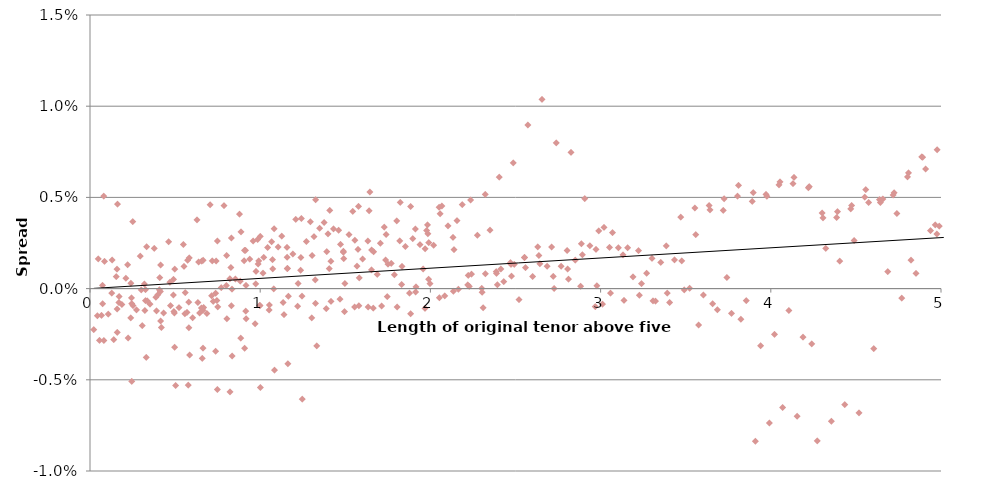
| Category | Series 0 |
|---|---|
| 0.02226133437632427 | -0.002 |
| 0.04349449318648535 | -0.001 |
| 0.048596851471595315 | 0.002 |
| 0.05544147843942504 | -0.003 |
| 0.06791390980302747 | -0.001 |
| 0.07311306079273194 | 0 |
| 0.07388937779081495 | -0.001 |
| 0.08145106091717924 | 0.005 |
| 0.08172484599589236 | -0.003 |
| 0.08514120763027044 | 0.001 |
| 0.10674358723639976 | -0.001 |
| 0.12811897206147727 | 0 |
| 0.13030008285601102 | 0.002 |
| 0.1393192707361086 | -0.003 |
| 0.15465254512050297 | 0.001 |
| 0.15889312603891614 | -0.001 |
| 0.15906317888283894 | 0.001 |
| 0.16019686450897908 | -0.002 |
| 0.1618917245200615 | 0.005 |
| 0.1697141553404382 | -0.001 |
| 0.17079145502359605 | 0 |
| 0.18750675456608512 | -0.001 |
| 0.210781917147421 | 0.001 |
| 0.22108145106091737 | 0.001 |
| 0.22394374961110142 | -0.003 |
| 0.23887748117727448 | -0.002 |
| 0.24037085433389294 | 0 |
| 0.24363612659300493 | -0.001 |
| 0.24476981221914684 | -0.005 |
| 0.2450016210958612 | -0.001 |
| 0.2511978097193701 | 0.004 |
| 0.25206894406073044 | -0.001 |
| 0.27322506377947864 | -0.001 |
| 0.2950034223134832 | 0.002 |
| 0.30113099312277924 | 0 |
| 0.30660669469704427 | -0.002 |
| 0.31978817680752236 | 0 |
| 0.32275527347395894 | -0.001 |
| 0.32588029507947525 | -0.001 |
| 0.32599091531329716 | 0 |
| 0.33071993030925206 | -0.004 |
| 0.3324621989919736 | 0.002 |
| 0.3361956318835171 | -0.001 |
| 0.3526423862531063 | -0.001 |
| 0.37741273100615924 | 0.002 |
| 0.3868458714454617 | 0 |
| 0.39082819986310824 | -0.001 |
| 0.39919385504601124 | 0 |
| 0.40737975234895174 | 0 |
| 0.4101176031360847 | 0.001 |
| 0.4133828753951967 | 0 |
| 0.41481698771226583 | 0.001 |
| 0.41546885694729596 | -0.002 |
| 0.4188585769694608 | -0.002 |
| 0.43204806449159694 | -0.001 |
| 0.4618878725654918 | 0.003 |
| 0.4695740034549072 | 0 |
| 0.4732375085557834 | -0.001 |
| 0.4900426974348946 | 0.001 |
| 0.4901730712818999 | 0 |
| 0.49278054822202755 | -0.001 |
| 0.49573766411548803 | -0.001 |
| 0.49695251132622786 | -0.003 |
| 0.4974799327982078 | 0.001 |
| 0.503080082135523 | -0.005 |
| 0.5230272807274856 | -0.001 |
| 0.5486148636478259 | 0.002 |
| 0.5522369485408491 | 0.001 |
| 0.5577126501151142 | -0.001 |
| 0.559566266796355 | 0 |
| 0.5701574264202609 | -0.001 |
| 0.5742642026009586 | 0.002 |
| 0.5770020533880906 | -0.005 |
| 0.5798643519382738 | -0.001 |
| 0.5809132687982785 | -0.002 |
| 0.583430050888313 | 0.002 |
| 0.5854893908281991 | -0.004 |
| 0.6030116358658457 | -0.002 |
| 0.6283693491085689 | 0.004 |
| 0.6337764328686211 | -0.001 |
| 0.6381870666309561 | 0.001 |
| 0.64443964119745 | -0.001 |
| 0.6540352187169445 | -0.001 |
| 0.6566735112936346 | 0.002 |
| 0.6594113620807667 | -0.004 |
| 0.6637421442349574 | -0.001 |
| 0.6639614093412867 | -0.003 |
| 0.6644888308132666 | 0.002 |
| 0.6680029985984826 | -0.001 |
| 0.6868894281625293 | -0.001 |
| 0.7056810403832996 | 0.005 |
| 0.7146551068522315 | 0 |
| 0.7189380020894127 | 0.002 |
| 0.7241941266581922 | -0.001 |
| 0.7378833805938525 | -0.003 |
| 0.7386596975919355 | 0 |
| 0.7411486528529645 | 0.002 |
| 0.7460969329552487 | -0.001 |
| 0.7485343570514535 | -0.006 |
| 0.7486155186360532 | 0.003 |
| 0.750357787318773 | -0.001 |
| 0.7715139070375212 | 0 |
| 0.7873842717677144 | 0.005 |
| 0.8015058179329237 | 0 |
| 0.8032913727940949 | 0.002 |
| 0.8042436687200549 | -0.002 |
| 0.8213226426778775 | 0.001 |
| 0.8224563283040203 | -0.006 |
| 0.8278756439353003 | 0.001 |
| 0.8306698806654182 | -0.001 |
| 0.8309703073563446 | 0.003 |
| 0.8344844751415597 | -0.004 |
| 0.8344844751415597 | 0 |
| 0.854176852123465 | 0.001 |
| 0.8781656399726234 | 0.004 |
| 0.8832090493173395 | 0 |
| 0.8857273230989859 | -0.003 |
| 0.8868114845635642 | 0.003 |
| 0.9055441478439414 | 0.002 |
| 0.9076301293960443 | 0.002 |
| 0.9084064463941255 | -0.003 |
| 0.9136332524422874 | 0.002 |
| 0.914800690981389 | -0.001 |
| 0.9171474202275016 | 0 |
| 0.9171474202275016 | -0.002 |
| 0.9383983572895271 | 0.002 |
| 0.9582151820344835 | 0.003 |
| 0.9696880805710366 | -0.002 |
| 0.973990417522244 | 0 |
| 0.9755754890305832 | 0.001 |
| 0.9849418206707741 | 0.003 |
| 0.9879534565366184 | 0.001 |
| 0.9910693914800692 | 0.002 |
| 0.9975880838303839 | -0.001 |
| 0.9992829438414654 | -0.001 |
| 0.9995833705323935 | 0.003 |
| 1.0013689253935674 | -0.005 |
| 1.016427104722795 | 0.001 |
| 1.020807665982204 | 0.002 |
| 1.043930060357166 | 0.002 |
| 1.0525169560077154 | -0.001 |
| 1.0540399595841068 | -0.001 |
| 1.0666450520551907 | 0.003 |
| 1.07242859809595 | 0.002 |
| 1.0734241802003615 | 0.001 |
| 1.0800461111711517 | 0 |
| 1.082135523613963 | 0.003 |
| 1.0837782340862416 | -0.004 |
| 1.105282807541534 | 0.002 |
| 1.1266581923666097 | 0.003 |
| 1.1348717447280077 | -0.001 |
| 1.13975483790679 | -0.001 |
| 1.1574264202600943 | 0.002 |
| 1.1575508680231472 | 0.002 |
| 1.159155589178284 | 0.001 |
| 1.160555392588246 | 0.001 |
| 1.1622502525993301 | -0.004 |
| 1.1657644203845443 | 0 |
| 1.1920097986238698 | 0.002 |
| 1.2093211374525543 | 0.004 |
| 1.2194446924381737 | -0.001 |
| 1.2224829699162356 | 0 |
| 1.2374759623219589 | 0.001 |
| 1.238910074639028 | 0.002 |
| 1.24217534689814 | 0.004 |
| 1.245181742858172 | 0 |
| 1.2468232003094952 | -0.006 |
| 1.2717642840846137 | 0.003 |
| 1.2952712555426604 | 0.004 |
| 1.303575502754148 | -0.002 |
| 1.3051459150021776 | 0.002 |
| 1.3162217659137578 | 0.003 |
| 1.3231908406446395 | 0 |
| 1.3245874210966617 | -0.001 |
| 1.3263020347209258 | 0.005 |
| 1.3327733183996004 | -0.003 |
| 1.3490759753593435 | 0.003 |
| 1.376022191001118 | 0.004 |
| 1.3880577556142244 | -0.001 |
| 1.3910960330922828 | 0.002 |
| 1.3979249972981735 | 0.003 |
| 1.405918972654085 | 0.001 |
| 1.4086568234412171 | 0.004 |
| 1.415436263485545 | 0.002 |
| 1.4155666373325504 | -0.001 |
| 1.4307792067437584 | 0.003 |
| 1.4603755617057992 | 0.003 |
| 1.4688209229439106 | -0.001 |
| 1.4718469685507403 | 0.002 |
| 1.4885819177400288 | 0.002 |
| 1.4887063655030817 | 0.002 |
| 1.49131976852716 | 0.002 |
| 1.4955509924709105 | -0.001 |
| 1.4977910522058382 | 0 |
| 1.5215605749486638 | 0.003 |
| 1.5438956734752685 | 0.004 |
| 1.5545392321573042 | -0.001 |
| 1.5562003392554242 | 0.003 |
| 1.5687559075649427 | 0.001 |
| 1.5745320358301331 | 0.002 |
| 1.577269886617266 | 0.005 |
| 1.579428784767594 | -0.001 |
| 1.581917740028623 | 0.001 |
| 1.6016101170105284 | 0.002 |
| 1.6326596779422884 | 0.003 |
| 1.63395655463093 | -0.001 |
| 1.6397204510248926 | 0.004 |
| 1.6447638603696104 | 0.005 |
| 1.6544707858876242 | 0.001 |
| 1.6552829712885906 | 0.002 |
| 1.664053263642586 | -0.001 |
| 1.6665422189036159 | 0.002 |
| 1.6873249953332081 | 0.001 |
| 1.706149356965308 | 0.002 |
| 1.713362232869419 | -0.001 |
| 1.7284844554919125 | 0.003 |
| 1.7371989178970697 | 0.002 |
| 1.7396363419932745 | 0.003 |
| 1.7467162087285297 | 0 |
| 1.7506689067264007 | 0.001 |
| 1.7700531273426554 | 0.001 |
| 1.788140783169422 | 0.001 |
| 1.801974134514933 | 0.004 |
| 1.8043414491053094 | -0.001 |
| 1.8198618629830117 | 0.003 |
| 1.823156453762743 | 0.005 |
| 1.830937713894592 | 0 |
| 1.833023695446692 | 0.001 |
| 1.8527160724285983 | 0.002 |
| 1.8767606902265932 | 0 |
| 1.8839655607190462 | 0.004 |
| 1.8843258042436686 | -0.001 |
| 1.896189824321242 | 0.003 |
| 1.9119204582297629 | 0.003 |
| 1.9133470225872689 | 0 |
| 1.9156866405326385 | 0 |
| 1.9386661905187035 | 0.002 |
| 1.9567544023396186 | 0.001 |
| 1.968203596540354 | -0.001 |
| 1.9687965535290086 | 0.002 |
| 1.9777729745307822 | 0.003 |
| 1.9832486761050463 | 0.003 |
| 1.9854101372527833 | 0.003 |
| 1.9899286203187643 | 0.001 |
| 1.9902162096871594 | 0.003 |
| 1.9978221641466005 | 0 |
| 2.019417125977161 | 0.002 |
| 2.051983140603049 | 0.004 |
| 2.052828075415345 | 0 |
| 2.0574588421773132 | 0.004 |
| 2.0674015634568965 | 0.005 |
| 2.0845491552289346 | 0 |
| 2.103770496681846 | 0.003 |
| 2.1328618145866614 | 0.003 |
| 2.135491020501286 | 0 |
| 2.1383375161609264 | 0.002 |
| 2.156021470514066 | 0.004 |
| 2.1643036406896767 | 0 |
| 2.1872906084513133 | 0.005 |
| 2.2197125256673527 | 0 |
| 2.2224503764544847 | 0.001 |
| 2.227926078028746 | 0 |
| 2.2360151826270904 | 0.005 |
| 2.2416153319644083 | 0.001 |
| 2.2760546129183314 | 0.003 |
| 2.302121834360028 | 0 |
| 2.3039340308334157 | 0 |
| 2.30940973240768 | -0.001 |
| 2.3219653007171983 | 0.005 |
| 2.323318563348824 | 0.001 |
| 2.3495442919413536 | 0.003 |
| 2.3865969759193595 | 0.001 |
| 2.3878947883054673 | 0.001 |
| 2.393370489879728 | 0 |
| 2.4045174537987677 | 0.006 |
| 2.4140999315537304 | 0.001 |
| 2.431535718145466 | 0 |
| 2.4707236637421435 | 0.001 |
| 2.4733239670016935 | 0.001 |
| 2.4761993653164094 | 0.001 |
| 2.487069606880339 | 0.007 |
| 2.4921286789869956 | 0.001 |
| 2.520155625202637 | -0.001 |
| 2.553078452462434 | 0.002 |
| 2.553078452462434 | 0.002 |
| 2.5585541540367007 | 0.001 |
| 2.573019724970444 | 0.009 |
| 2.60014933731566 | 0.001 |
| 2.6303901437371673 | 0.002 |
| 2.6376514001726026 | 0.002 |
| 2.6431271017468676 | 0.001 |
| 2.6556826700563834 | 0.01 |
| 2.6860994554057687 | 0.001 |
| 2.7120933751215803 | 0.002 |
| 2.721782210488577 | 0.001 |
| 2.727257912062841 | 0 |
| 2.7399041752224518 | 0.008 |
| 2.768651608487339 | 0.001 |
| 2.8028747433264884 | 0.002 |
| 2.8062644633486507 | 0.001 |
| 2.811740164922914 | 0.001 |
| 2.8261464750171097 | 0.007 |
| 2.8512037615689074 | 0.002 |
| 2.882924285388353 | 0 |
| 2.8870276306783396 | 0.002 |
| 2.8925033322526037 | 0.002 |
| 2.9067886254744586 | 0.005 |
| 2.9371538796590135 | 0.002 |
| 2.9686391637110345 | -0.001 |
| 2.9727459398917313 | 0.002 |
| 2.9782216414659937 | 0 |
| 2.9890485968514735 | 0.003 |
| 3.01095140314853 | -0.001 |
| 3.0198168247449537 | 0.003 |
| 3.052163262365358 | 0.002 |
| 3.057638963939624 | 0 |
| 3.069489260454352 | 0.003 |
| 3.104038329911022 | 0.002 |
| 3.131568940603847 | 0.002 |
| 3.137044642178113 | -0.001 |
| 3.1587953456536617 | 0.002 |
| 3.190280629705681 | 0.001 |
| 3.222548156839734 | 0.002 |
| 3.2280238584140033 | 0 |
| 3.2400597349262643 | 0 |
| 3.2709227801630263 | 0.001 |
| 3.3025325119780984 | 0.002 |
| 3.308008213552359 | -0.001 |
| 3.3224145236465574 | -0.001 |
| 3.353182751540041 | 0.001 |
| 3.386410304274781 | 0.002 |
| 3.391886005849045 | 0 |
| 3.4050774687325003 | -0.001 |
| 3.4336234151429217 | 0.002 |
| 3.471034783149774 | 0.004 |
| 3.476510484724038 | 0.002 |
| 3.4910275868226055 | 0 |
| 3.522929500342233 | 0 |
| 3.5536977282357185 | 0.004 |
| 3.559173429809981 | 0.003 |
| 3.5756005345327733 | -0.002 |
| 3.604193889614834 | 0 |
| 3.637919233401778 | 0.005 |
| 3.6433949349760457 | 0.004 |
| 3.6579553232530664 | -0.001 |
| 3.686548678335125 | -0.001 |
| 3.7203285420944567 | 0.004 |
| 3.725804243668721 | 0.005 |
| 3.7420820110758495 | 0.001 |
| 3.769211623421068 | -0.001 |
| 3.8048036836537857 | 0.005 |
| 3.81027938522805 | 0.006 |
| 3.824744956161794 | -0.002 |
| 3.8551617415111767 | -0.001 |
| 3.8915306747361225 | 0.005 |
| 3.897006376310385 | 0.005 |
| 3.908966461327857 | -0.008 |
| 3.939734689221341 | -0.003 |
| 3.9712851601968637 | 0.005 |
| 3.9767608617711296 | 0.005 |
| 3.9913757700205323 | -0.007 |
| 4.022089477941636 | -0.003 |
| 4.048596851471595 | 0.006 |
| 4.0540725530458595 | 0.006 |
| 4.069847788533622 | -0.007 |
| 4.106216165764419 | -0.001 |
| 4.13030008285601 | 0.006 |
| 4.135775784430274 | 0.006 |
| 4.154420736243788 | -0.007 |
| 4.188879110850365 | -0.003 |
| 4.221081451060918 | 0.006 |
| 4.226557152635182 | 0.006 |
| 4.240370854333895 | -0.003 |
| 4.273100616016427 | -0.008 |
| 4.301130993122779 | 0.004 |
| 4.306606694697043 | 0.004 |
| 4.323033799419836 | 0.002 |
| 4.355509924709104 | -0.007 |
| 4.386845871445463 | 0.004 |
| 4.392321573019727 | 0.004 |
| 4.405388588140129 | 0.002 |
| 4.433981943222191 | -0.006 |
| 4.469574003454907 | 0.004 |
| 4.4750497050291695 | 0.005 |
| 4.489515275962914 | 0.003 |
| 4.518554890932354 | -0.007 |
| 4.55223694854085 | 0.005 |
| 4.557712650115116 | 0.005 |
| 4.574139754837905 | 0.005 |
| 4.604505009022464 | -0.003 |
| 4.638187066630957 | 0.005 |
| 4.643662768205219 | 0.005 |
| 4.6582664426606915 | 0.005 |
| 4.687167954108407 | 0.001 |
| 4.718938002089409 | 0.005 |
| 4.724413703663677 | 0.005 |
| 4.740621231380986 | 0.004 |
| 4.7695227428287 | -0.001 |
| 4.803291372794098 | 0.006 |
| 4.80876707436836 | 0.006 |
| 4.823284176466929 | 0.002 |
| 4.853649430651483 | 0.001 |
| 4.886811484563561 | 0.007 |
| 4.89228718613783 | 0.007 |
| 4.909234294557034 | 0.007 |
| 4.938273909526474 | 0.003 |
| 4.965776865160848 | 0.003 |
| 4.975575489030588 | 0.003 |
| 4.976728268309378 | 0.008 |
| 4.989869952087611 | 0.003 |
| 5.016427104722801 | 0.004 |